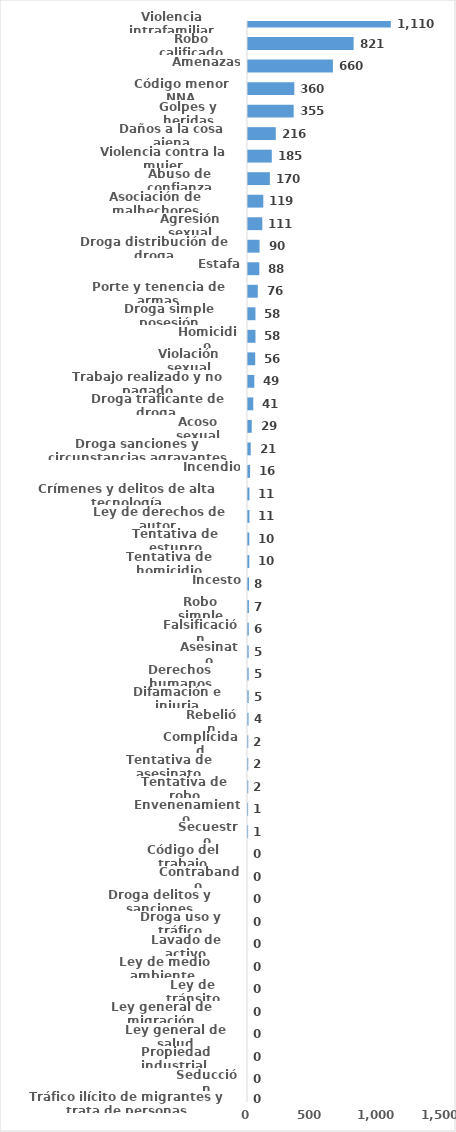
| Category | Series 0 |
|---|---|
| Violencia intrafamiliar | 1110 |
| Robo calificado | 821 |
| Amenazas | 660 |
| Código menor NNA | 360 |
| Golpes y heridas | 355 |
| Daños a la cosa ajena | 216 |
| Violencia contra la mujer | 185 |
| Abuso de confianza | 170 |
| Asociación de malhechores | 119 |
| Agresión sexual | 111 |
| Droga distribución de droga | 90 |
| Estafa | 88 |
| Porte y tenencia de armas | 76 |
| Droga simple posesión | 58 |
| Homicidio | 58 |
| Violación sexual | 56 |
| Trabajo realizado y no pagado | 49 |
| Droga traficante de droga  | 41 |
| Acoso sexual | 29 |
| Droga sanciones y circunstancias agravantes | 21 |
| Incendio | 16 |
| Crímenes y delitos de alta tecnología | 11 |
| Ley de derechos de autor  | 11 |
| Tentativa de estupro | 10 |
| Tentativa de homicidio | 10 |
| Incesto | 8 |
| Robo simple | 7 |
| Falsificación | 6 |
| Asesinato | 5 |
| Derechos humanos | 5 |
| Difamación e injuria | 5 |
| Rebelión | 4 |
| Complicidad | 2 |
| Tentativa de asesinato | 2 |
| Tentativa de robo | 2 |
| Envenenamiento | 1 |
| Secuestro | 1 |
| Código del trabajo | 0 |
| Contrabando | 0 |
| Droga delitos y sanciones | 0 |
| Droga uso y tráfico | 0 |
| Lavado de activo | 0 |
| Ley de medio ambiente  | 0 |
| Ley de tránsito | 0 |
| Ley general de migración | 0 |
| Ley general de salud | 0 |
| Propiedad industrial  | 0 |
| Seducción | 0 |
| Tráfico ilícito de migrantes y trata de personas | 0 |